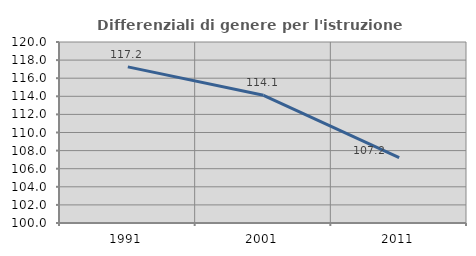
| Category | Differenziali di genere per l'istruzione superiore |
|---|---|
| 1991.0 | 117.249 |
| 2001.0 | 114.114 |
| 2011.0 | 107.23 |